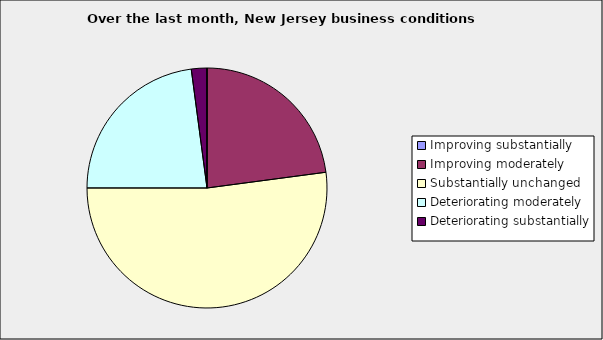
| Category | Series 0 |
|---|---|
| Improving substantially | 0 |
| Improving moderately | 0.229 |
| Substantially unchanged | 0.521 |
| Deteriorating moderately | 0.229 |
| Deteriorating substantially | 0.021 |